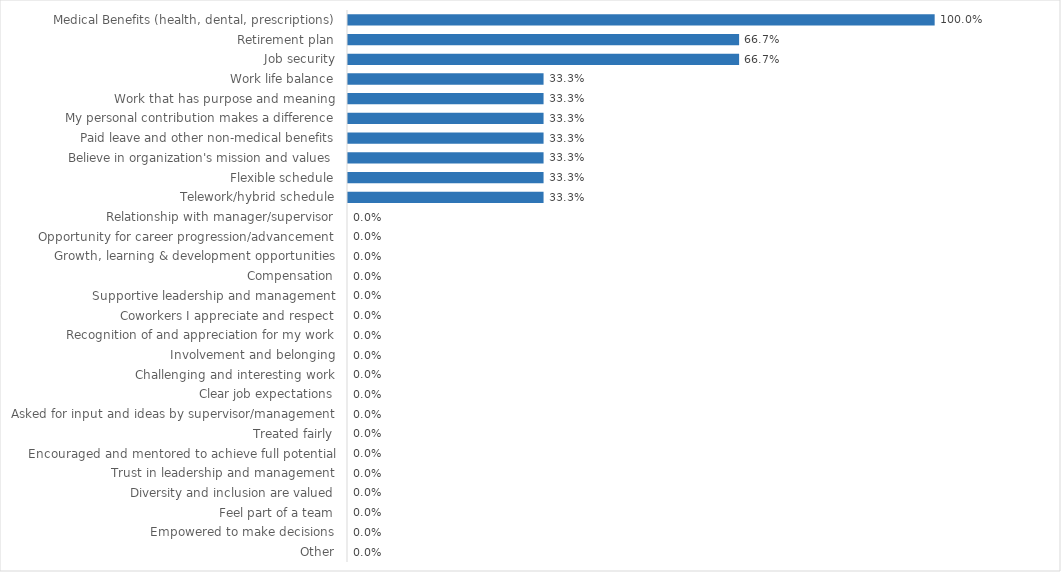
| Category | Enhanced 911 Board |
|---|---|
| Medical Benefits (health, dental, prescriptions) | 1 |
| Retirement plan | 0.667 |
| Job security | 0.667 |
| Work life balance | 0.333 |
| Work that has purpose and meaning | 0.333 |
| My personal contribution makes a difference | 0.333 |
| Paid leave and other non-medical benefits | 0.333 |
| Believe in organization's mission and values | 0.333 |
| Flexible schedule | 0.333 |
| Telework/hybrid schedule | 0.333 |
| Relationship with manager/supervisor | 0 |
| Opportunity for career progression/advancement | 0 |
| Growth, learning & development opportunities | 0 |
| Compensation | 0 |
| Supportive leadership and management | 0 |
| Coworkers I appreciate and respect | 0 |
| Recognition of and appreciation for my work | 0 |
| Involvement and belonging | 0 |
| Challenging and interesting work | 0 |
| Clear job expectations | 0 |
| Asked for input and ideas by supervisor/management | 0 |
| Treated fairly | 0 |
| Encouraged and mentored to achieve full potential | 0 |
| Trust in leadership and management | 0 |
| Diversity and inclusion are valued | 0 |
| Feel part of a team | 0 |
| Empowered to make decisions | 0 |
| Other | 0 |